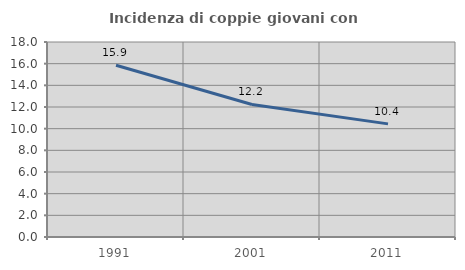
| Category | Incidenza di coppie giovani con figli |
|---|---|
| 1991.0 | 15.851 |
| 2001.0 | 12.233 |
| 2011.0 | 10.443 |